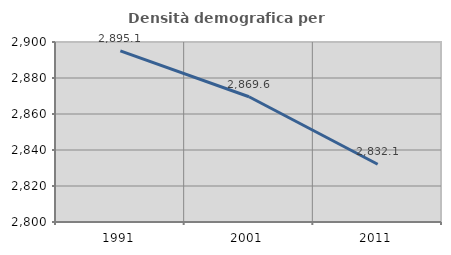
| Category | Densità demografica |
|---|---|
| 1991.0 | 2895.066 |
| 2001.0 | 2869.57 |
| 2011.0 | 2832.075 |